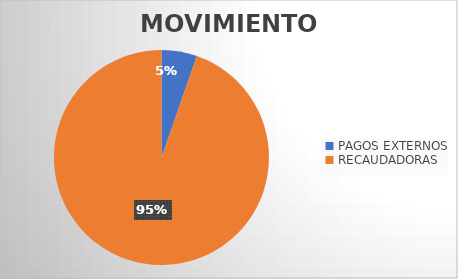
| Category | MOVIMIENTOS |
|---|---|
| PAGOS EXTERNOS | 818 |
| RECAUDADORAS | 14483 |